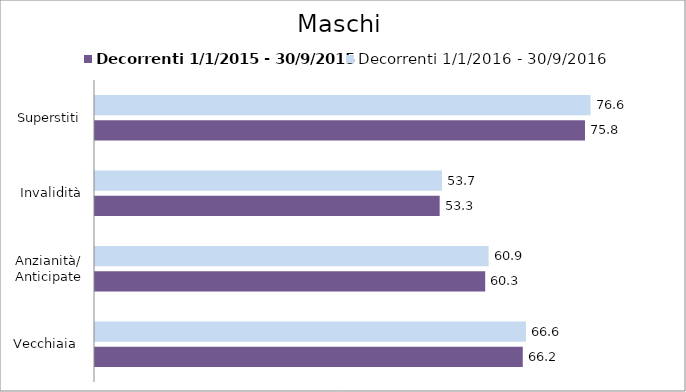
| Category | Decorrenti 1/1/2015 - 30/9/2015 | Decorrenti 1/1/2016 - 30/9/2016 |
|---|---|---|
| Vecchiaia  | 66.15 | 66.64 |
| Anzianità/ Anticipate | 60.34 | 60.87 |
| Invalidità | 53.3 | 53.66 |
| Superstiti | 75.77 | 76.63 |